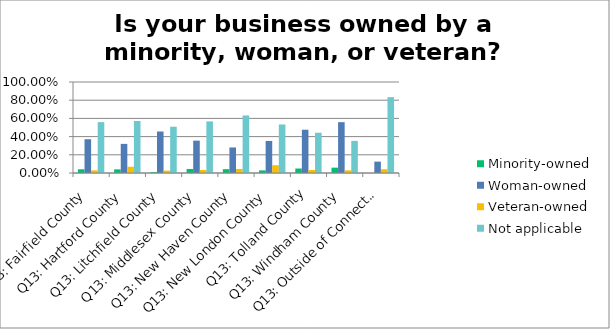
| Category | Minority-owned | Woman-owned | Veteran-owned | Not applicable |
|---|---|---|---|---|
| Q13: Fairfield County | 0.041 | 0.371 | 0.029 | 0.559 |
| Q13: Hartford County | 0.04 | 0.32 | 0.069 | 0.571 |
| Q13: Litchfield County | 0.009 | 0.456 | 0.026 | 0.509 |
| Q13: Middlesex County | 0.044 | 0.356 | 0.033 | 0.567 |
| Q13: New Haven County | 0.042 | 0.281 | 0.045 | 0.632 |
| Q13: New London County | 0.029 | 0.352 | 0.086 | 0.533 |
| Q13: Tolland County | 0.049 | 0.475 | 0.033 | 0.443 |
| Q13: Windham County | 0.059 | 0.559 | 0.029 | 0.353 |
| Q13: Outside of Connecticut | 0 | 0.125 | 0.042 | 0.833 |